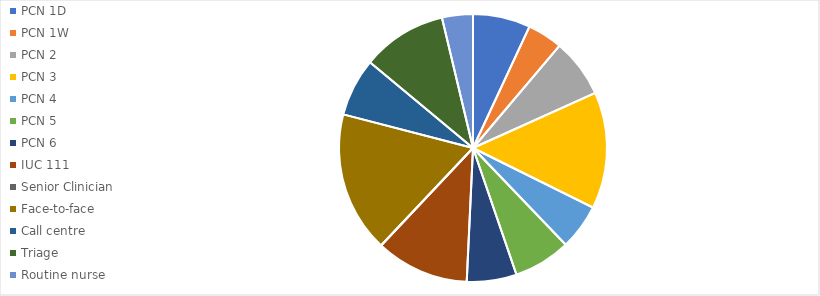
| Category | % of total |
|---|---|
| PCN 1D | 0.069 |
| PCN 1W | 0.043 |
| PCN 2 | 0.071 |
| PCN 3 | 0.141 |
| PCN 4 | 0.055 |
| PCN 5 | 0.069 |
| PCN 6 | 0.06 |
| IUC 111 | 0.113 |
| Senior Clinician | 0 |
| Face-to-face | 0.17 |
| Call centre | 0.07 |
| Triage | 0.102 |
| Routine nurse | 0.037 |